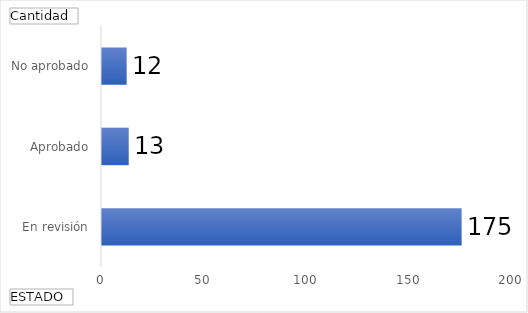
| Category | Total |
|---|---|
| En revisión | 175 |
| Aprobado | 13 |
| No aprobado | 12 |